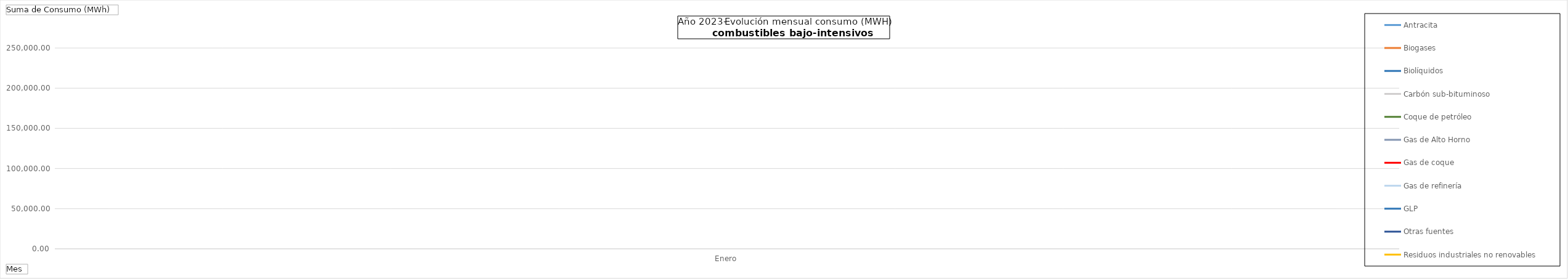
| Category | Antracita | Biogases | Biolíquidos | Carbón sub-bituminoso | Coque de petróleo | Gas de Alto Horno | Gas de coque | Gas de refinería | GLP | Otras fuentes | Residuos industriales no renovables |
|---|---|---|---|---|---|---|---|---|---|---|---|
| Enero | 0 | 139637.29 | 0 | 0 | 0 | 216401 | 2262.85 | 110398 | 0 | 40686.93 | 42539 |